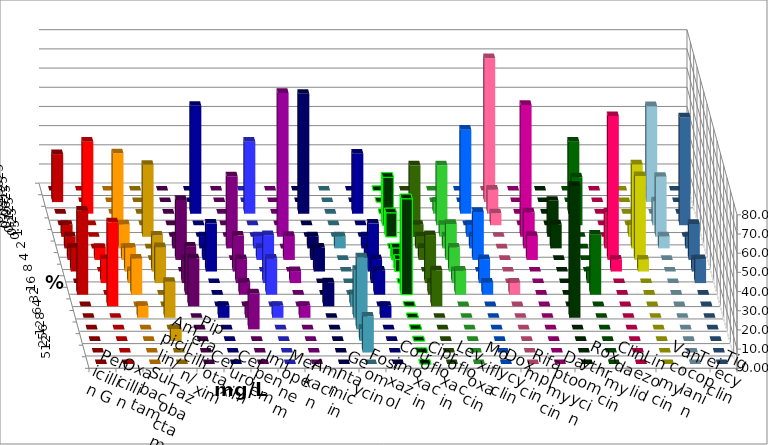
| Category | Penicillin G | Oxacillin | Ampicillin/ Sulbactam | Piperacillin/ Tazobactam | Cefotaxim | Cefuroxim | Imipenem | Meropenem | Amikacin | Gentamicin | Fosfomycin | Cotrimoxazol | Ciprofloxacin | Levofloxacin | Moxifloxacin | Doxycyclin | Rifampicin | Daptomycin | Roxythromycin | Clindamycin | Linezolid | Vancomycin | Teicoplanin | Tigecyclin |
|---|---|---|---|---|---|---|---|---|---|---|---|---|---|---|---|---|---|---|---|---|---|---|---|---|
| 0.015625 | 0 | 0 | 0 | 0 | 0 | 0 | 0 | 0 | 0 | 0 | 0 | 0 | 0 | 0 | 0 | 0 | 0 | 0 | 0 | 0 | 0 | 0 | 0 | 0 |
| 0.03125 | 25 | 0 | 0 | 0 | 0 | 0 | 0 | 0 | 0 | 0 | 0 | 0 | 0 | 0 | 0 | 0 | 75 | 0 | 0 | 0 | 0 | 0 | 0 | 50 |
| 0.0625 | 0 | 37.5 | 0 | 0 | 0 | 0 | 56.25 | 37.5 | 0 | 62.5 | 0 | 31.25 | 0 | 0 | 6.25 | 43.75 | 12.5 | 0 | 0 | 37.5 | 0 | 0 | 0 | 0 |
| 0.125 | 0 | 0 | 37.5 | 0 | 0 | 0 | 0 | 0 | 0 | 0 | 0 | 0 | 25 | 31.25 | 31.25 | 0 | 6.25 | 0 | 0 | 25 | 0 | 0 | 56.25 | 12.5 |
| 0.25 | 6.25 | 0 | 0 | 37.5 | 0 | 0 | 0 | 0 | 75 | 0 | 0 | 0 | 12.5 | 6.25 | 6.25 | 6.25 | 0 | 68.75 | 18.75 | 0 | 0 | 6.25 | 0 | 31.25 |
| 0.5 | 6.25 | 0 | 12.5 | 0 | 6.25 | 37.5 | 6.25 | 6.25 | 0 | 6.25 | 6.25 | 6.25 | 0 | 6.25 | 6.25 | 6.25 | 0 | 18.75 | 12.5 | 0 | 18.75 | 43.75 | 6.25 | 6.25 |
| 1.0 | 6.25 | 6.25 | 6.25 | 0 | 31.25 | 0 | 6.25 | 6.25 | 12.5 | 6.25 | 0 | 6.25 | 6.25 | 6.25 | 18.75 | 25 | 0 | 12.5 | 0 | 0 | 75 | 43.75 | 18.75 | 0 |
| 2.0 | 12.5 | 0 | 12.5 | 18.75 | 0 | 18.75 | 25 | 0 | 0 | 12.5 | 0 | 25 | 6.25 | 0 | 12.5 | 0 | 0 | 0 | 0 | 0 | 6.25 | 6.25 | 6.25 | 0 |
| 4.0 | 0 | 12.5 | 6.25 | 18.75 | 12.5 | 12.5 | 0 | 25 | 6.25 | 0 | 0 | 12.5 | 0 | 25 | 6.25 | 12.5 | 0 | 0 | 0 | 6.25 | 0 | 0 | 12.5 | 0 |
| 8.0 | 43.75 | 0 | 18.75 | 0 | 25 | 6.25 | 0 | 18.75 | 0 | 0 | 0 | 12.5 | 50 | 6.25 | 12.5 | 6.25 | 6.25 | 0 | 0 | 31.25 | 0 | 0 | 0 | 0 |
| 16.0 | 0 | 43.75 | 0 | 0 | 25 | 0 | 0 | 0 | 0 | 12.5 | 6.25 | 0 | 0 | 18.75 | 0 | 0 | 0 | 0 | 0 | 0 | 0 | 0 | 0 | 0 |
| 32.0 | 0 | 0 | 6.25 | 18.75 | 0 | 6.25 | 6.25 | 6.25 | 6.25 | 0 | 25 | 6.25 | 0 | 0 | 0 | 0 | 0 | 0 | 68.75 | 0 | 0 | 0 | 0 | 0 |
| 64.0 | 0 | 0 | 0 | 0 | 0 | 18.75 | 0 | 0 | 0 | 0 | 37.5 | 0 | 0 | 0 | 0 | 0 | 0 | 0 | 0 | 0 | 0 | 0 | 0 | 0 |
| 128.0 | 0 | 0 | 0 | 6.25 | 0 | 0 | 0 | 0 | 0 | 0 | 6.25 | 0 | 0 | 0 | 0 | 0 | 0 | 0 | 0 | 0 | 0 | 0 | 0 | 0 |
| 256.0 | 0 | 0 | 0 | 0 | 0 | 0 | 0 | 0 | 0 | 0 | 18.75 | 0 | 0 | 0 | 0 | 0 | 0 | 0 | 0 | 0 | 0 | 0 | 0 | 0 |
| 512.0 | 0 | 0 | 0 | 0 | 0 | 0 | 0 | 0 | 0 | 0 | 0 | 0 | 0 | 0 | 0 | 0 | 0 | 0 | 0 | 0 | 0 | 0 | 0 | 0 |